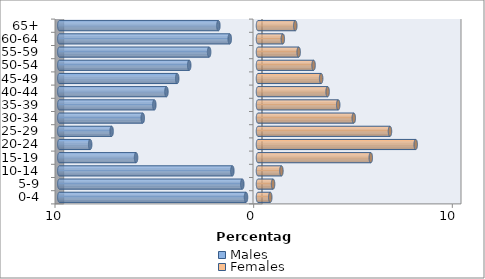
| Category | Males | Females |
|---|---|---|
| 0-4 | -0.603 | 0.617 |
| 5-9 | -0.79 | 0.758 |
| 10-14 | -1.292 | 1.179 |
| 15-19 | -6.138 | 5.677 |
| 20-24 | -8.448 | 7.939 |
| 25-29 | -7.368 | 6.643 |
| 30-34 | -5.802 | 4.821 |
| 35-39 | -5.219 | 4.038 |
| 40-44 | -4.609 | 3.504 |
| 45-49 | -4.067 | 3.179 |
| 50-54 | -3.462 | 2.798 |
| 55-59 | -2.46 | 2.047 |
| 60-64 | -1.423 | 1.249 |
| 65+ | -1.994 | 1.877 |